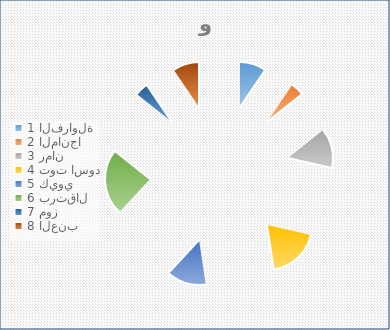
| Category | الكيلو | السعر |
|---|---|---|
| 0 | 2 | 5.5 |
| 1 | 1 | 2.25 |
| 2 | 3 | 8.5 |
| 3 | 4 | 7.3 |
| 4 | 3 | 10 |
| 5 | 5 | 12.1 |
| 6 | 1 | 3 |
| 7 | 2 | 9.8 |